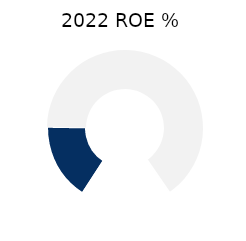
| Category | Series 1 |
|---|---|
| 0 | 25.729 |
| 1 | 104.271 |
| 2 | 30 |